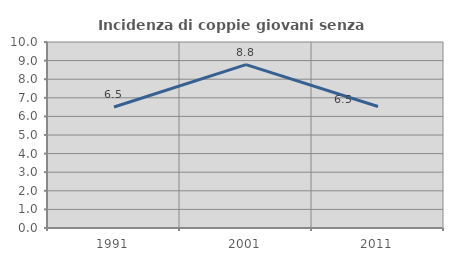
| Category | Incidenza di coppie giovani senza figli |
|---|---|
| 1991.0 | 6.504 |
| 2001.0 | 8.78 |
| 2011.0 | 6.534 |